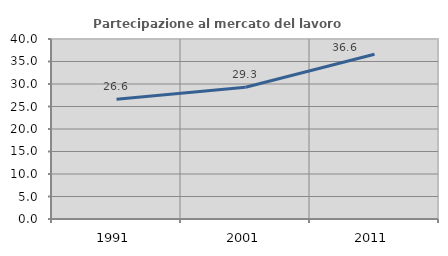
| Category | Partecipazione al mercato del lavoro  femminile |
|---|---|
| 1991.0 | 26.599 |
| 2001.0 | 29.274 |
| 2011.0 | 36.605 |